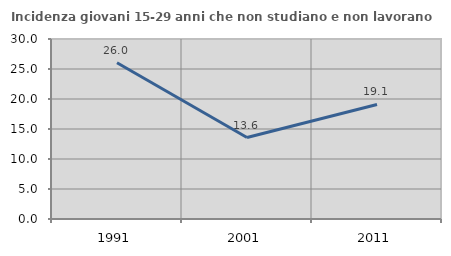
| Category | Incidenza giovani 15-29 anni che non studiano e non lavorano  |
|---|---|
| 1991.0 | 26.042 |
| 2001.0 | 13.571 |
| 2011.0 | 19.084 |